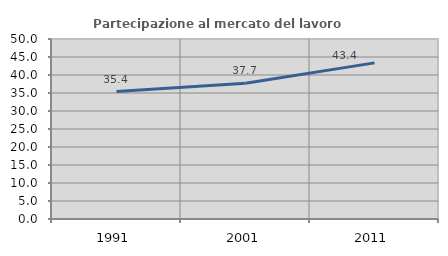
| Category | Partecipazione al mercato del lavoro  femminile |
|---|---|
| 1991.0 | 35.409 |
| 2001.0 | 37.684 |
| 2011.0 | 43.369 |